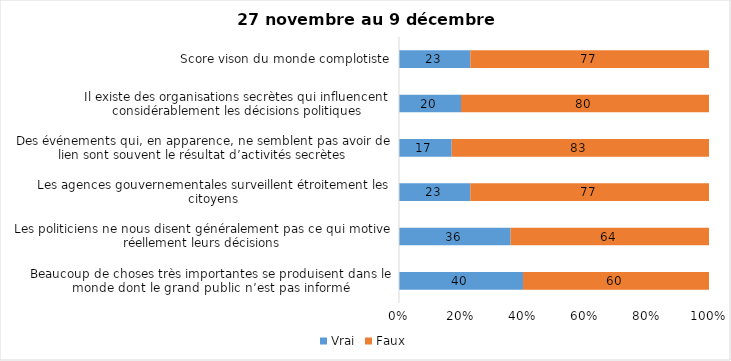
| Category | Vrai | Faux |
|---|---|---|
| Beaucoup de choses très importantes se produisent dans le monde dont le grand public n’est pas informé | 40 | 60 |
| Les politiciens ne nous disent généralement pas ce qui motive réellement leurs décisions | 36 | 64 |
| Les agences gouvernementales surveillent étroitement les citoyens | 23 | 77 |
| Des événements qui, en apparence, ne semblent pas avoir de lien sont souvent le résultat d’activités secrètes | 17 | 83 |
| Il existe des organisations secrètes qui influencent considérablement les décisions politiques | 20 | 80 |
| Score vison du monde complotiste | 23 | 77 |